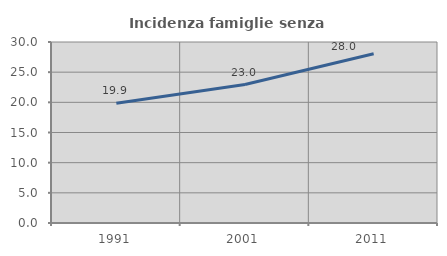
| Category | Incidenza famiglie senza nuclei |
|---|---|
| 1991.0 | 19.86 |
| 2001.0 | 22.951 |
| 2011.0 | 28.041 |